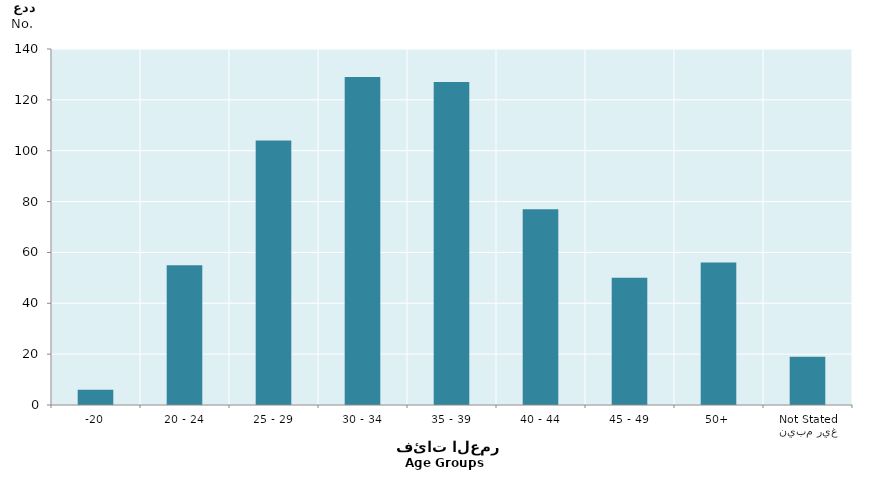
| Category | Series 0 |
|---|---|
| -20 | 6 |
| 20 - 24 | 55 |
| 25 - 29 | 104 |
| 30 - 34 | 129 |
| 35 - 39 | 127 |
| 40 - 44 | 77 |
| 45 - 49 | 50 |
| 50+ | 56 |
| غير مبين
Not Stated | 19 |